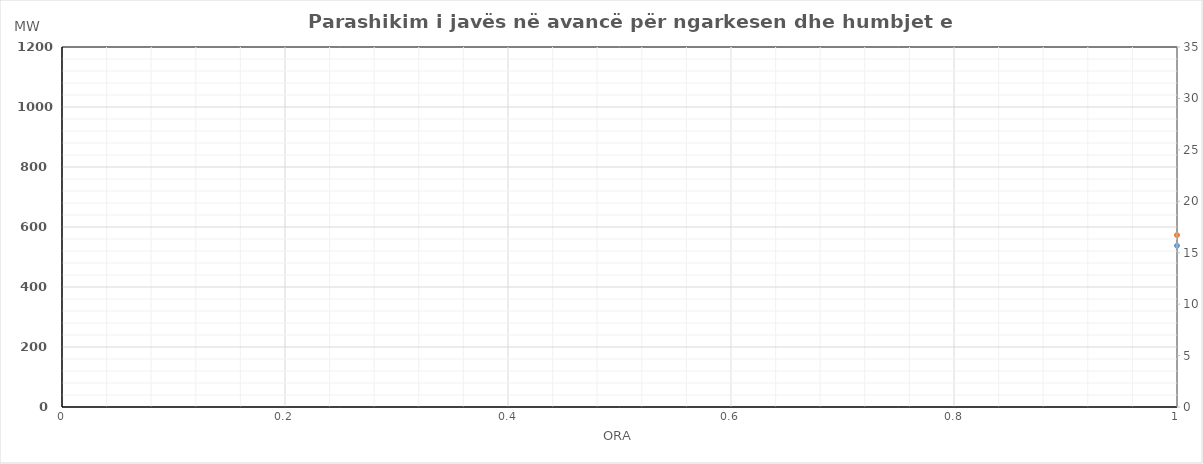
| Category | Ngarkesa (MWh) |
|---|---|
| 0 | 573.052 |
| 1 | 519.844 |
| 2 | 498.107 |
| 3 | 487.287 |
| 4 | 486.911 |
| 5 | 522.855 |
| 6 | 617.684 |
| 7 | 765.195 |
| 8 | 848.263 |
| 9 | 877.315 |
| 10 | 895.799 |
| 11 | 918.125 |
| 12 | 925.508 |
| 13 | 932.341 |
| 14 | 922.332 |
| 15 | 898.387 |
| 16 | 876.445 |
| 17 | 880.925 |
| 18 | 897.972 |
| 19 | 950.397 |
| 20 | 934.223 |
| 21 | 818.692 |
| 22 | 718.679 |
| 23 | 619.843 |
| 24 | 588.866 |
| 25 | 546.19 |
| 26 | 527.825 |
| 27 | 520.424 |
| 28 | 520.436 |
| 29 | 550.291 |
| 30 | 626.681 |
| 31 | 755.858 |
| 32 | 851.891 |
| 33 | 880.572 |
| 34 | 905.233 |
| 35 | 917.853 |
| 36 | 918.953 |
| 37 | 902.231 |
| 38 | 880.645 |
| 39 | 851.202 |
| 40 | 846.172 |
| 41 | 860.95 |
| 42 | 884.187 |
| 43 | 945.794 |
| 44 | 933.562 |
| 45 | 846.586 |
| 46 | 749.069 |
| 47 | 652.097 |
| 48 | 595.959 |
| 49 | 548.017 |
| 50 | 527.966 |
| 51 | 518.856 |
| 52 | 518.674 |
| 53 | 551.573 |
| 54 | 637.182 |
| 55 | 775.527 |
| 56 | 865.077 |
| 57 | 893.944 |
| 58 | 915.516 |
| 59 | 932.989 |
| 60 | 937.231 |
| 61 | 932.286 |
| 62 | 916.488 |
| 63 | 889.795 |
| 64 | 876.308 |
| 65 | 885.937 |
| 66 | 906.079 |
| 67 | 963.096 |
| 68 | 948.893 |
| 69 | 847.639 |
| 70 | 748.874 |
| 71 | 650.97 |
| 72 | 593.958 |
| 73 | 554.714 |
| 74 | 536.143 |
| 75 | 526.81 |
| 76 | 528.288 |
| 77 | 561.358 |
| 78 | 634.962 |
| 79 | 765.32 |
| 80 | 858.81 |
| 81 | 902.592 |
| 82 | 905.429 |
| 83 | 919.527 |
| 84 | 920.575 |
| 85 | 913.071 |
| 86 | 890.69 |
| 87 | 867.597 |
| 88 | 858.457 |
| 89 | 875.956 |
| 90 | 903.484 |
| 91 | 961.377 |
| 92 | 959.29 |
| 93 | 867.444 |
| 94 | 760.096 |
| 95 | 672.667 |
| 96 | 552.896 |
| 97 | 513.769 |
| 98 | 491.895 |
| 99 | 485.341 |
| 100 | 488.048 |
| 101 | 518.444 |
| 102 | 599.227 |
| 103 | 728.748 |
| 104 | 825.841 |
| 105 | 861.315 |
| 106 | 867.589 |
| 107 | 884.038 |
| 108 | 885.45 |
| 109 | 882.45 |
| 110 | 862.622 |
| 111 | 851.513 |
| 112 | 847.018 |
| 113 | 862.099 |
| 114 | 888.136 |
| 115 | 945.635 |
| 116 | 950.64 |
| 117 | 867.537 |
| 118 | 760.933 |
| 119 | 654.839 |
| 120 | 605.497 |
| 121 | 562.544 |
| 122 | 540.989 |
| 123 | 531.782 |
| 124 | 532.572 |
| 125 | 558.114 |
| 126 | 605.433 |
| 127 | 704.88 |
| 128 | 771.029 |
| 129 | 818.291 |
| 130 | 833.648 |
| 131 | 849.834 |
| 132 | 856.039 |
| 133 | 848.522 |
| 134 | 823.319 |
| 135 | 803.052 |
| 136 | 819.693 |
| 137 | 843.182 |
| 138 | 871.889 |
| 139 | 938.073 |
| 140 | 923.673 |
| 141 | 845.373 |
| 142 | 741.453 |
| 143 | 650.94 |
| 144 | 565.594 |
| 145 | 519.657 |
| 146 | 502.6 |
| 147 | 495.064 |
| 148 | 501.279 |
| 149 | 536.447 |
| 150 | 627.188 |
| 151 | 768.536 |
| 152 | 846.713 |
| 153 | 861.718 |
| 154 | 869.728 |
| 155 | 887.114 |
| 156 | 887.666 |
| 157 | 900.086 |
| 158 | 884.27 |
| 159 | 872.821 |
| 160 | 862.848 |
| 161 | 876.676 |
| 162 | 901.288 |
| 163 | 957.926 |
| 164 | 951.665 |
| 165 | 864.569 |
| 166 | 759.455 |
| 167 | 658.808 |